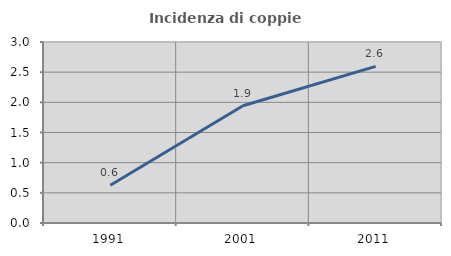
| Category | Incidenza di coppie miste |
|---|---|
| 1991.0 | 0.626 |
| 2001.0 | 1.944 |
| 2011.0 | 2.596 |